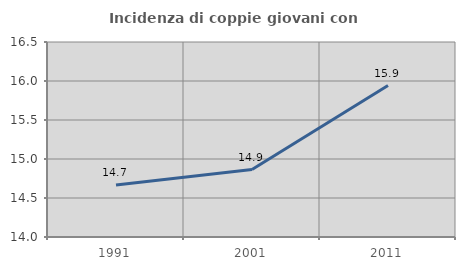
| Category | Incidenza di coppie giovani con figli |
|---|---|
| 1991.0 | 14.667 |
| 2001.0 | 14.865 |
| 2011.0 | 15.942 |